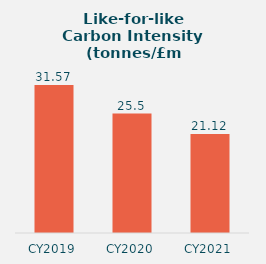
| Category | Series 0 |
|---|---|
| CY2019 | 31.57 |
| CY2020 | 25.5 |
| CY2021 | 21.12 |